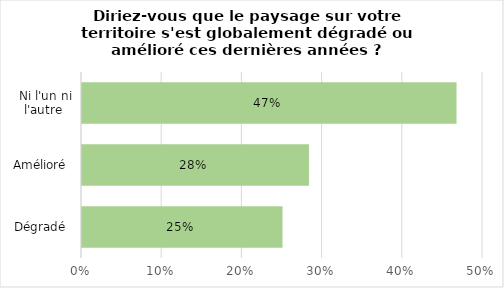
| Category | Series 0 |
|---|---|
| Dégradé  | 0.25 |
| Amélioré  | 0.283 |
| Ni l'un ni l'autre  | 0.467 |